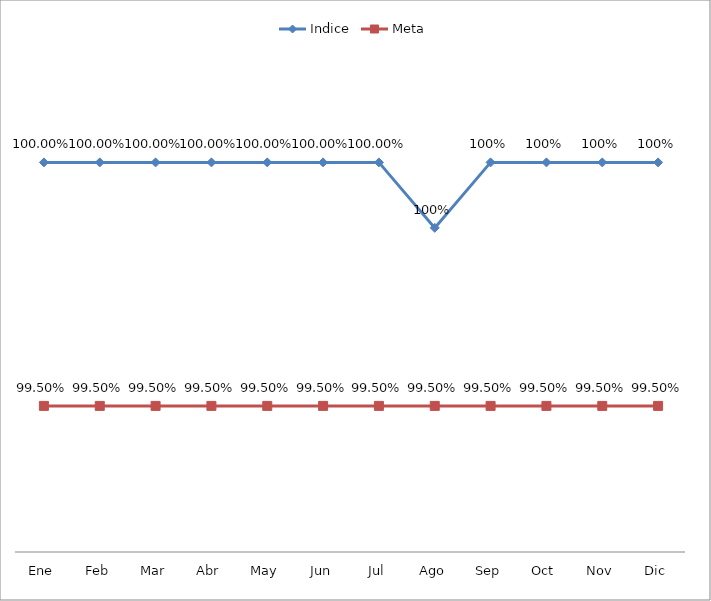
| Category | Indice | Meta |
|---|---|---|
| Ene | 1 | 0.995 |
| Feb | 1 | 0.995 |
| Mar | 1 | 0.995 |
| Abr | 1 | 0.995 |
| May | 1 | 0.995 |
| Jun | 1 | 0.995 |
| Jul | 1 | 0.995 |
| Ago | 0.999 | 0.995 |
| Sep | 1 | 0.995 |
| Oct | 1 | 0.995 |
| Nov | 1 | 0.995 |
| Dic | 1 | 0.995 |